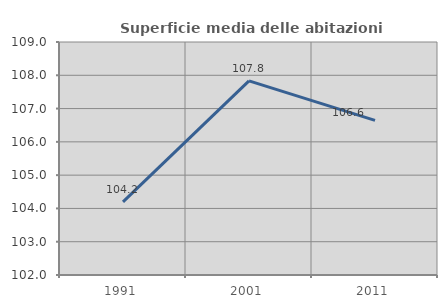
| Category | Superficie media delle abitazioni occupate |
|---|---|
| 1991.0 | 104.199 |
| 2001.0 | 107.832 |
| 2011.0 | 106.644 |